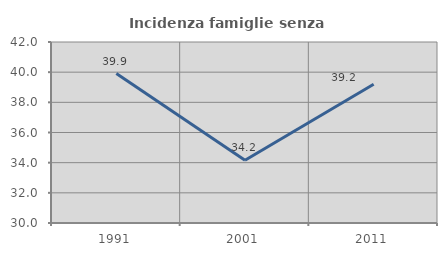
| Category | Incidenza famiglie senza nuclei |
|---|---|
| 1991.0 | 39.91 |
| 2001.0 | 34.16 |
| 2011.0 | 39.194 |